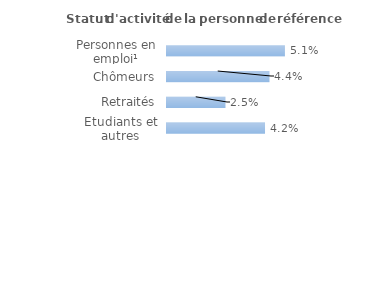
| Category | Series 0 |
|---|---|
| Personnes en emploi¹ | 0.051 |
| Chômeurs | 0.044 |
| Retraités | 0.025 |
| Etudiants et autres inactifs | 0.042 |